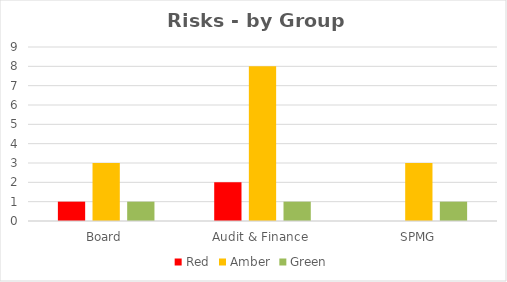
| Category | Red | Amber | Green |
|---|---|---|---|
| Board | 1 | 3 | 1 |
| Audit & Finance | 2 | 8 | 1 |
| SPMG | 0 | 3 | 1 |